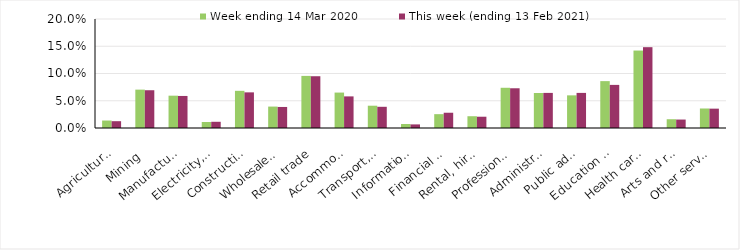
| Category | Week ending 14 Mar 2020 | This week (ending 13 Feb 2021) |
|---|---|---|
| Agriculture, forestry and fishing | 0.014 | 0.012 |
| Mining | 0.07 | 0.069 |
| Manufacturing | 0.059 | 0.059 |
| Electricity, gas, water and waste services | 0.011 | 0.011 |
| Construction | 0.068 | 0.065 |
| Wholesale trade | 0.039 | 0.039 |
| Retail trade | 0.096 | 0.095 |
| Accommodation and food services | 0.065 | 0.058 |
| Transport, postal and warehousing | 0.041 | 0.039 |
| Information media and telecommunications | 0.007 | 0.007 |
| Financial and insurance services | 0.025 | 0.028 |
| Rental, hiring and real estate services | 0.022 | 0.021 |
| Professional, scientific and technical services | 0.074 | 0.073 |
| Administrative and support services | 0.064 | 0.064 |
| Public administration and safety | 0.06 | 0.064 |
| Education and training | 0.086 | 0.079 |
| Health care and social assistance | 0.142 | 0.148 |
| Arts and recreation services | 0.016 | 0.016 |
| Other services | 0.036 | 0.036 |